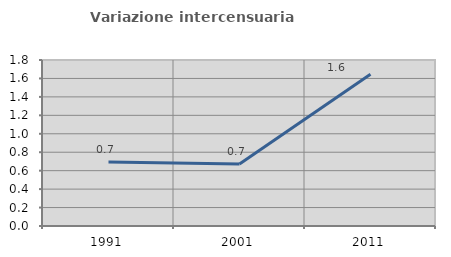
| Category | Variazione intercensuaria annua |
|---|---|
| 1991.0 | 0.695 |
| 2001.0 | 0.672 |
| 2011.0 | 1.646 |